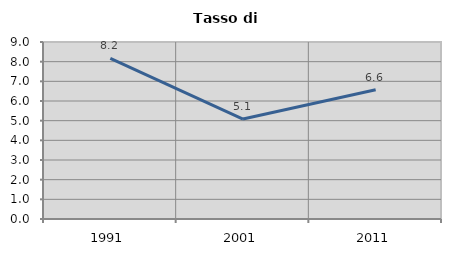
| Category | Tasso di disoccupazione   |
|---|---|
| 1991.0 | 8.163 |
| 2001.0 | 5.082 |
| 2011.0 | 6.576 |